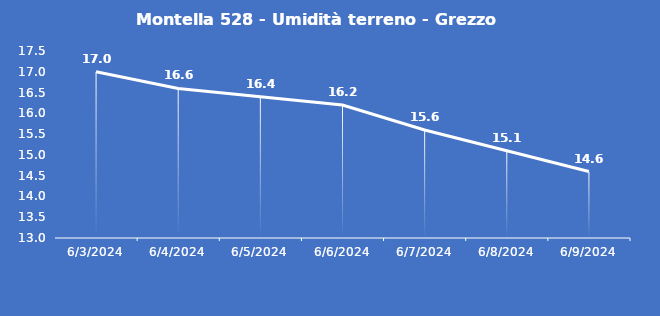
| Category | Montella 528 - Umidità terreno - Grezzo (%VWC) |
|---|---|
| 6/3/24 | 17 |
| 6/4/24 | 16.6 |
| 6/5/24 | 16.4 |
| 6/6/24 | 16.2 |
| 6/7/24 | 15.6 |
| 6/8/24 | 15.1 |
| 6/9/24 | 14.6 |